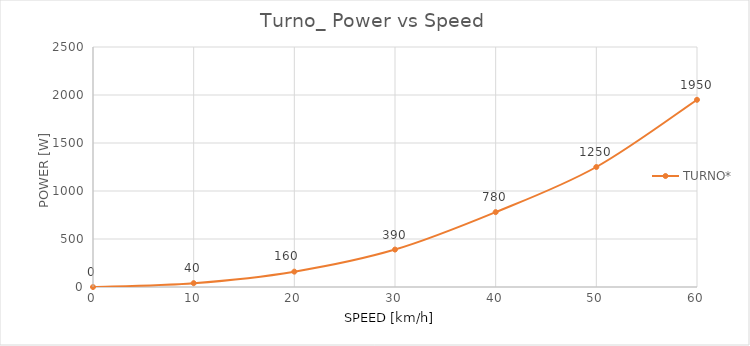
| Category | TURNO* |
|---|---|
| 0.0 | 0 |
| 10.0 | 40 |
| 20.0 | 160 |
| 30.0 | 390 |
| 40.0 | 780 |
| 50.0 | 1250 |
| 60.0 | 1950 |